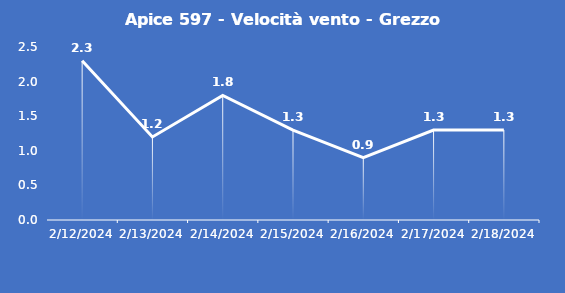
| Category | Apice 597 - Velocità vento - Grezzo (m/s) |
|---|---|
| 2/12/24 | 2.3 |
| 2/13/24 | 1.2 |
| 2/14/24 | 1.8 |
| 2/15/24 | 1.3 |
| 2/16/24 | 0.9 |
| 2/17/24 | 1.3 |
| 2/18/24 | 1.3 |